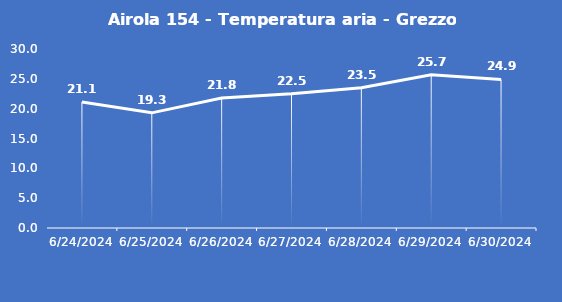
| Category | Airola 154 - Temperatura aria - Grezzo (°C) |
|---|---|
| 6/24/24 | 21.1 |
| 6/25/24 | 19.3 |
| 6/26/24 | 21.8 |
| 6/27/24 | 22.5 |
| 6/28/24 | 23.5 |
| 6/29/24 | 25.7 |
| 6/30/24 | 24.9 |